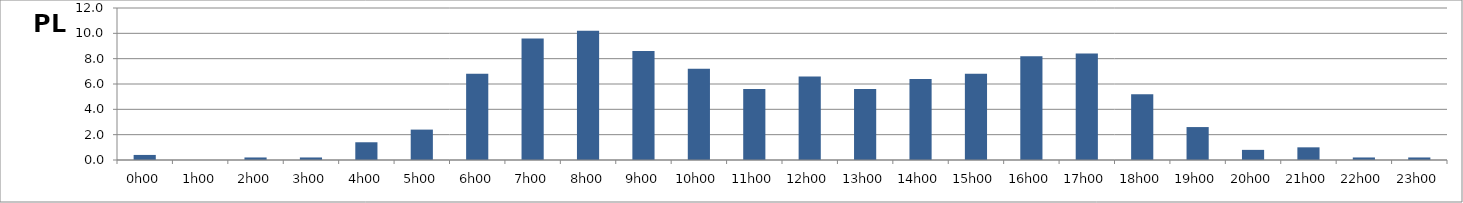
| Category | PL |
|---|---|
| 0.0 | 0.4 |
| 0.041666666666666664 | 0 |
| 0.08333333333333333 | 0.2 |
| 0.125 | 0.2 |
| 0.16666666666666666 | 1.4 |
| 0.20833333333333334 | 2.4 |
| 0.25 | 6.8 |
| 0.2916666666666667 | 9.6 |
| 0.3333333333333333 | 10.2 |
| 0.375 | 8.6 |
| 0.4166666666666667 | 7.2 |
| 0.4583333333333333 | 5.6 |
| 0.5 | 6.6 |
| 0.5416666666666666 | 5.6 |
| 0.5833333333333334 | 6.4 |
| 0.625 | 6.8 |
| 0.6666666666666666 | 8.2 |
| 0.7083333333333334 | 8.4 |
| 0.75 | 5.2 |
| 0.7916666666666666 | 2.6 |
| 0.8333333333333334 | 0.8 |
| 0.875 | 1 |
| 0.9166666666666666 | 0.2 |
| 0.9583333333333334 | 0.2 |